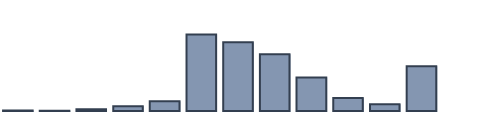
| Category | Series 0 |
|---|---|
| 0 | 0.164 |
| 1 | 0.092 |
| 2 | 0.563 |
| 3 | 1.506 |
| 4 | 3.047 |
| 5 | 24.119 |
| 6 | 21.706 |
| 7 | 17.902 |
| 8 | 10.545 |
| 9 | 4.061 |
| 10 | 2.154 |
| 11 | 14.142 |
| 12 | 0 |